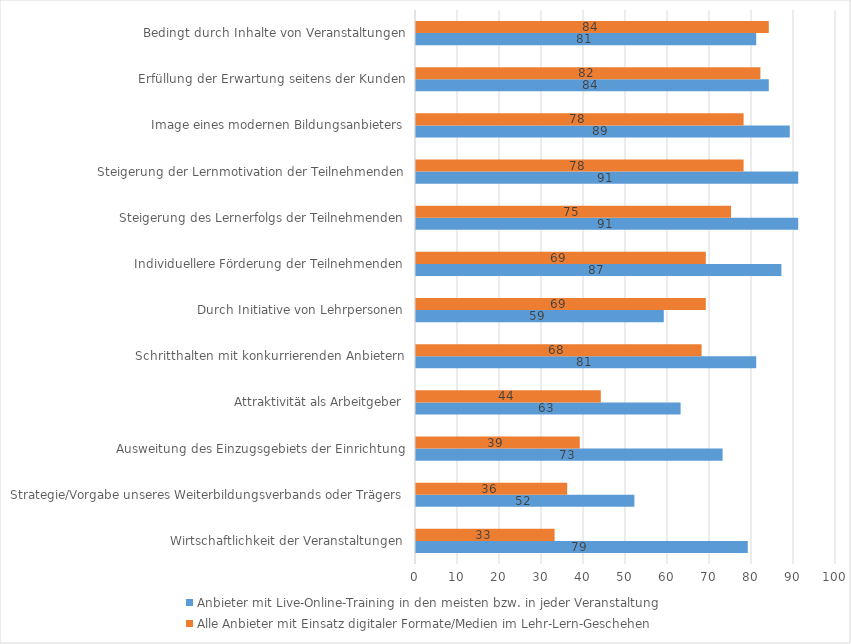
| Category | Anbieter mit Live-Online-Training in den meisten bzw. in jeder Veranstaltung | Alle Anbieter mit Einsatz digitaler Formate/Medien im Lehr-Lern-Geschehen |
|---|---|---|
| Wirtschaftlichkeit der Veranstaltungen | 79 | 33 |
| Strategie/Vorgabe unseres Weiterbildungsverbands oder Trägers | 52 | 36 |
| Ausweitung des Einzugsgebiets der Einrichtung | 73 | 39 |
| Attraktivität als Arbeitgeber | 63 | 44 |
| Schritthalten mit konkurrierenden Anbietern | 81 | 68 |
| Durch Initiative von Lehrpersonen | 59 | 69 |
| Individuellere Förderung der Teilnehmenden | 87 | 69 |
| Steigerung des Lernerfolgs der Teilnehmenden | 91 | 75 |
| Steigerung der Lernmotivation der Teilnehmenden | 91 | 78 |
| Image eines modernen Bildungsanbieters | 89 | 78 |
| Erfüllung der Erwartung seitens der Kunden | 84 | 82 |
| Bedingt durch Inhalte von Veranstaltungen | 81 | 84 |